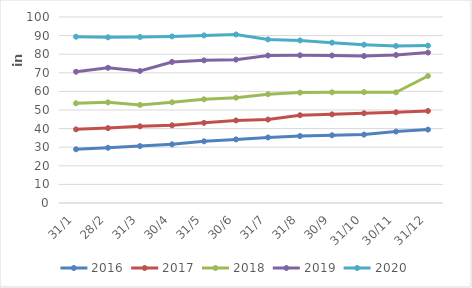
| Category | 2016 | 2017 | 2018 | 2019 | 2020 |
|---|---|---|---|---|---|
| 31/1 | 28886 | 39595 | 53611 | 70573 | 89403 |
| 28/2 | 29684 | 40260 | 54109 | 72693 | 89083 |
| 31/3 | 30602 | 41220 | 52707 | 70989 | 89252 |
| 30/4 | 31534 | 41783 | 54162 | 75819 | 89567 |
| 31/5 | 33168 | 43082 | 55739 | 76699 | 90103 |
| 30/6 | 34200 | 44387 | 56615 | 77072 | 90615 |
| 31/7 | 35239 | 44864 | 58482 | 79301 | 87942 |
| 31/8 | 35983 | 47191 | 59349 | 79413 | 87408 |
| 30/9 | 36419 | 47669 | 59513 | 79325 | 86216 |
| 31/10 | 36774 | 48229 | 59593 | 79013 | 85116 |
| 30/11 | 38396 | 48750 | 59522 | 79561 | 84424 |
| 31/12 | 39458 | 49476 | 68284 | 80884 | 84624 |